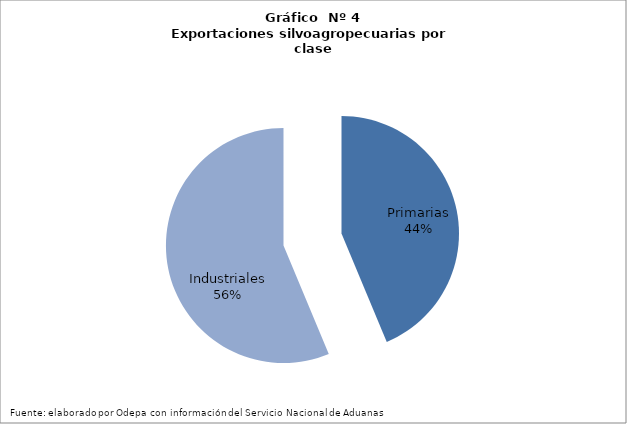
| Category | Series 0 |
|---|---|
| Primarias | 3117246 |
| Industriales | 4015288 |